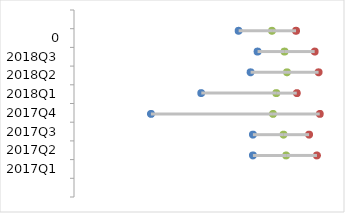
| Category | Categories |
|---|---|
|  | 84.091 |
| 2017Q1 | 0 |
| 2017Q2 | 0 |
| 2017Q3 | 0 |
| 2017Q4 | 0 |
| 2018Q1 | 0 |
| 2018Q2 | 0 |
| 2018Q3 | 0 |
| 0 | 0 |